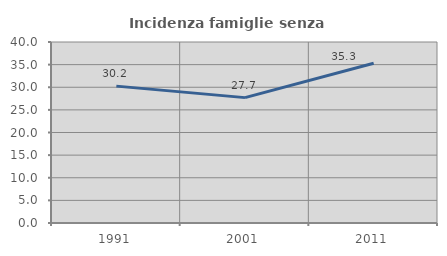
| Category | Incidenza famiglie senza nuclei |
|---|---|
| 1991.0 | 30.248 |
| 2001.0 | 27.708 |
| 2011.0 | 35.309 |